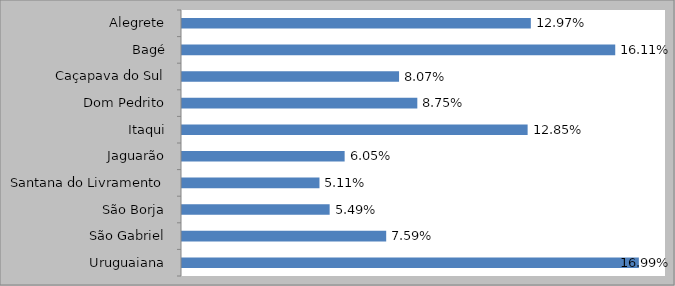
| Category | MATRIZ 2015
(% de Alunos Equivalentes) |
|---|---|
| Alegrete | 0.13 |
| Bagé | 0.161 |
| Caçapava do Sul | 0.081 |
| Dom Pedrito | 0.088 |
| Itaqui | 0.129 |
| Jaguarão | 0.06 |
| Santana do Livramento | 0.051 |
| São Borja | 0.055 |
| São Gabriel | 0.076 |
| Uruguaiana | 0.17 |